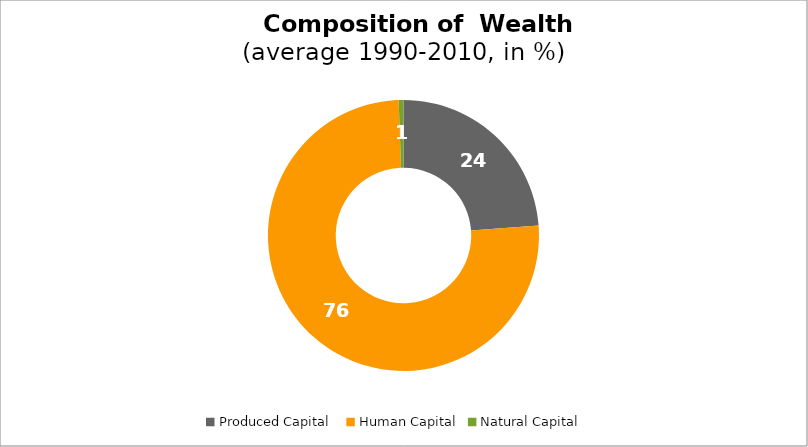
| Category | Series 0 |
|---|---|
| Produced Capital  | 23.831 |
| Human Capital | 75.594 |
| Natural Capital | 0.575 |